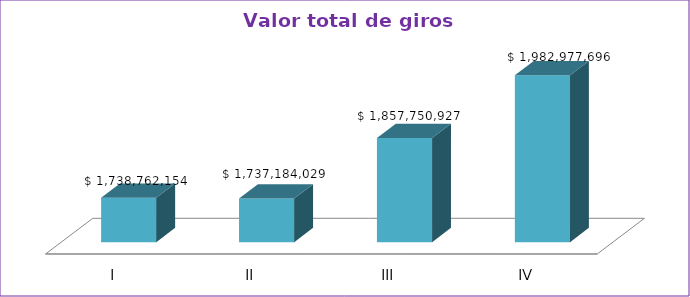
| Category | Series 0 |
|---|---|
| I | 1738762154 |
| II | 1737184029 |
| III | 1857750927 |
| IV | 1982977696 |